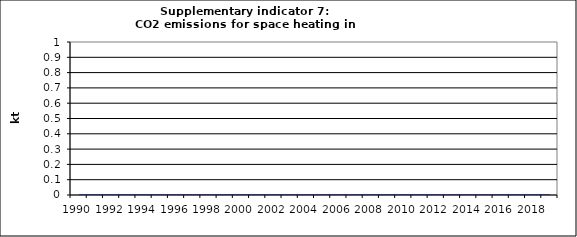
| Category | CO2 emissions for space heating in households, kt |
|---|---|
| 1990 | 0 |
| 1991 | 0 |
| 1992 | 0 |
| 1993 | 0 |
| 1994 | 0 |
| 1995 | 0 |
| 1996 | 0 |
| 1997 | 0 |
| 1998 | 0 |
| 1999 | 0 |
| 2000 | 0 |
| 2001 | 0 |
| 2002 | 0 |
| 2003 | 0 |
| 2004 | 0 |
| 2005 | 0 |
| 2006 | 0 |
| 2007 | 0 |
| 2008 | 0 |
| 2009 | 0 |
| 2010 | 0 |
| 2011 | 0 |
| 2012 | 0 |
| 2013 | 0 |
| 2014 | 0 |
| 2015 | 0 |
| 2016 | 0 |
| 2017 | 0 |
| 2018 | 0 |
| 2019 | 0 |